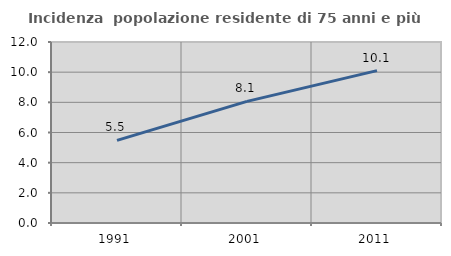
| Category | Incidenza  popolazione residente di 75 anni e più |
|---|---|
| 1991.0 | 5.477 |
| 2001.0 | 8.062 |
| 2011.0 | 10.103 |